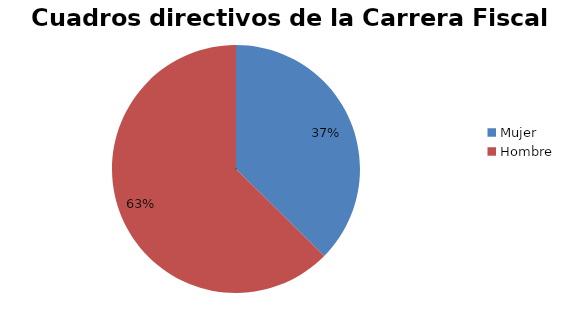
| Category | Series 0 |
|---|---|
| Mujer | 46 |
| Hombre | 77 |